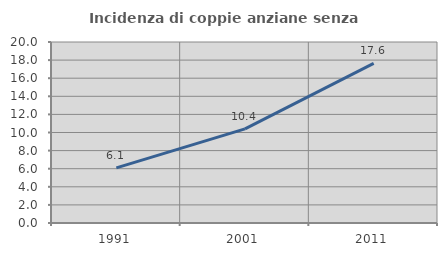
| Category | Incidenza di coppie anziane senza figli  |
|---|---|
| 1991.0 | 6.098 |
| 2001.0 | 10.405 |
| 2011.0 | 17.647 |